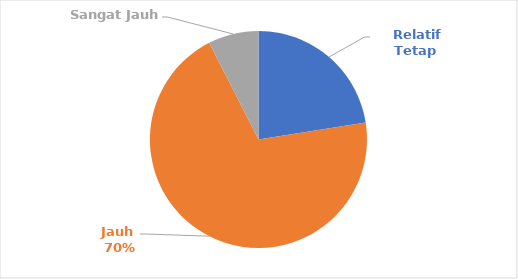
| Category | 2. Persepsi Nelayan Mengenai Fishing Ground Dalam 5 Tahun Terakhir |
|---|---|
| Relatif Tetap  | 9 |
| Jauh  | 28 |
|  Sangat Jauh   | 3 |